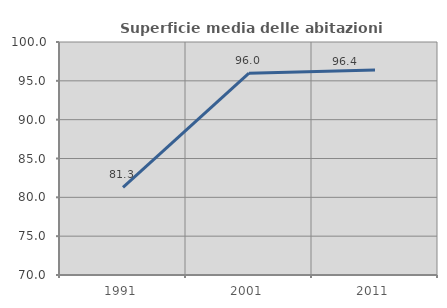
| Category | Superficie media delle abitazioni occupate |
|---|---|
| 1991.0 | 81.289 |
| 2001.0 | 95.991 |
| 2011.0 | 96.401 |